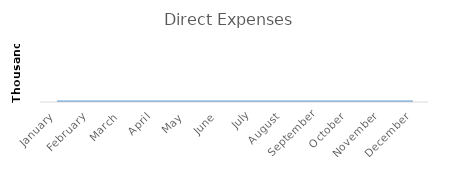
| Category | Direct Expenses |
|---|---|
| January | 0 |
| February | 0 |
| March | 0 |
| April | 0 |
| May | 0 |
| June | 0 |
| July | 0 |
| August | 0 |
| September | 0 |
| October | 0 |
| November | 0 |
| December | 0 |